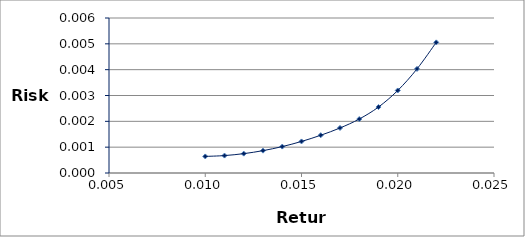
| Category | Risk |
|---|---|
| 0.009999999999999998 | 0.001 |
| 0.010999999999999998 | 0.001 |
| 0.011999999999999997 | 0.001 |
| 0.012999999999999996 | 0.001 |
| 0.013999999999999995 | 0.001 |
| 0.014999999999999994 | 0.001 |
| 0.015999999999999993 | 0.001 |
| 0.016999999999999994 | 0.002 |
| 0.017999999999999995 | 0.002 |
| 0.018999999999999996 | 0.003 |
| 0.019999999999999997 | 0.003 |
| 0.020999999999999998 | 0.004 |
| 0.022 | 0.005 |